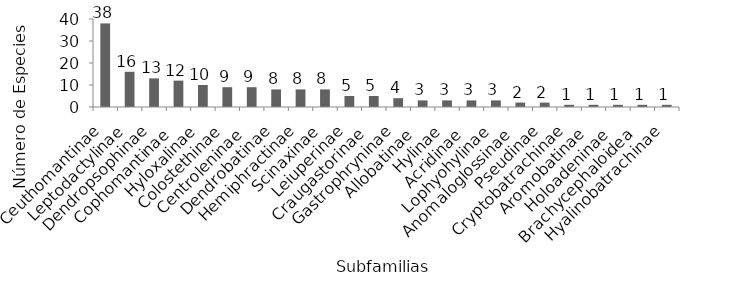
| Category | No. Especies |
|---|---|
| Ceuthomantinae | 38 |
| Leptodactylinae | 16 |
| Dendropsophinae | 13 |
| Cophomantinae  | 12 |
| Hyloxalinae | 10 |
| Colostethinae | 9 |
| Centroleninae  | 9 |
| Dendrobatinae | 8 |
| Hemiphractinae | 8 |
| Scinaxinae | 8 |
| Leiuperinae | 5 |
| Craugastorinae  | 5 |
| Gastrophryninae | 4 |
| Allobatinae  | 3 |
| Hylinae | 3 |
| Acridinae  | 3 |
| Lophyohylinae | 3 |
| Anomaloglossinae  | 2 |
| Pseudinae | 2 |
| Cryptobatrachinae | 1 |
| Aromobatinae  | 1 |
| Holoadeninae  | 1 |
| Brachycephaloidea  | 1 |
| Hyalinobatrachinae | 1 |